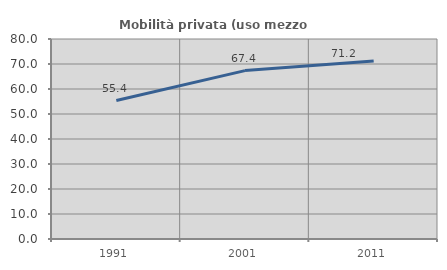
| Category | Mobilità privata (uso mezzo privato) |
|---|---|
| 1991.0 | 55.375 |
| 2001.0 | 67.364 |
| 2011.0 | 71.244 |